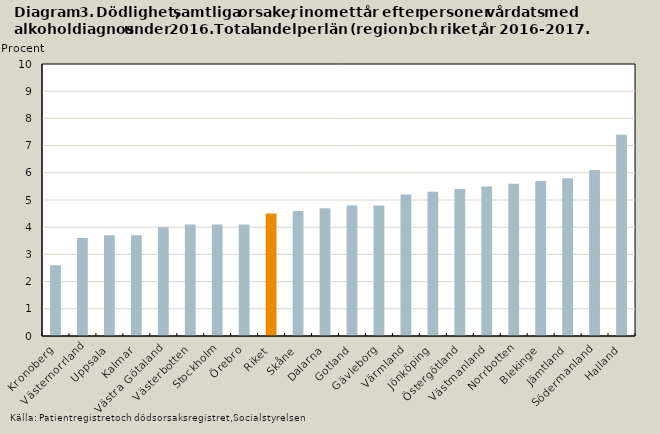
| Category | Totalt |
|---|---|
| Kronoberg | 2.6 |
| Västernorrland | 3.6 |
| Uppsala | 3.7 |
| Kalmar | 3.7 |
| Västra Götaland | 4 |
| Västerbotten | 4.1 |
| Stockholm | 4.1 |
| Örebro | 4.1 |
| Riket | 4.5 |
| Skåne | 4.6 |
| Dalarna | 4.7 |
| Gotland | 4.8 |
| Gävleborg | 4.8 |
| Värmland | 5.2 |
| Jönköping | 5.3 |
| Östergötland | 5.4 |
| Västmanland | 5.5 |
| Norrbotten | 5.6 |
| Blekinge | 5.7 |
| Jämtland | 5.8 |
| Södermanland | 6.1 |
| Halland | 7.4 |